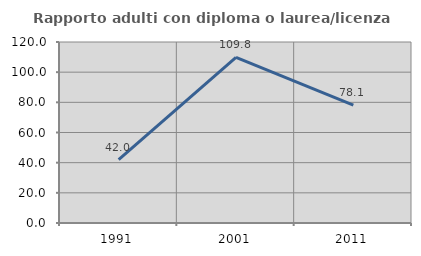
| Category | Rapporto adulti con diploma o laurea/licenza media  |
|---|---|
| 1991.0 | 42.017 |
| 2001.0 | 109.836 |
| 2011.0 | 78.146 |